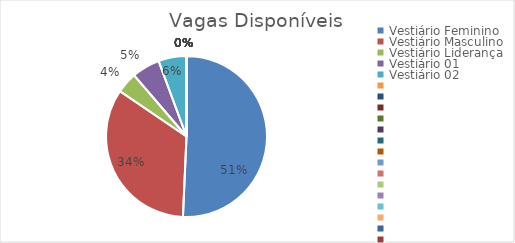
| Category | Vagas Disponíveis |
|---|---|
| Vestiário Feminino | 36 |
| Vestiário Masculino | 24 |
| Vestiário Liderança | 3 |
| Vestiário 01 | 4 |
| Vestiário 02 | 4 |